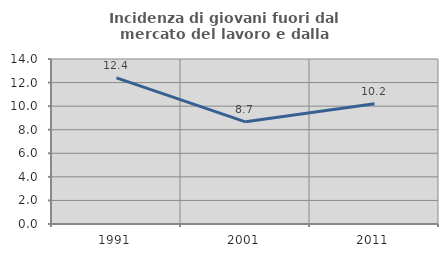
| Category | Incidenza di giovani fuori dal mercato del lavoro e dalla formazione  |
|---|---|
| 1991.0 | 12.4 |
| 2001.0 | 8.671 |
| 2011.0 | 10.196 |